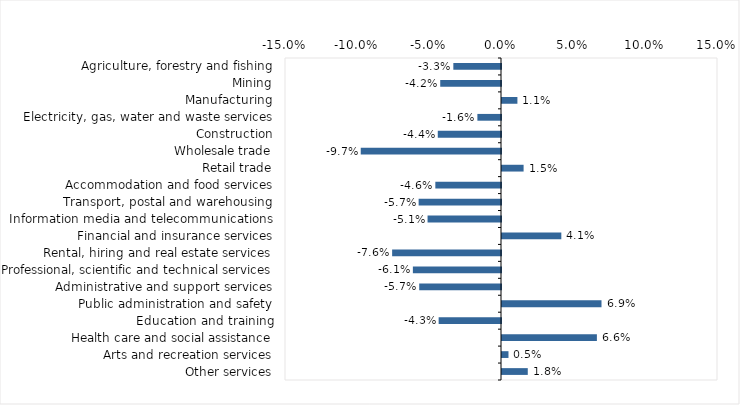
| Category | This week |
|---|---|
| Agriculture, forestry and fishing | -0.033 |
| Mining | -0.042 |
| Manufacturing | 0.011 |
| Electricity, gas, water and waste services | -0.016 |
| Construction | -0.044 |
| Wholesale trade | -0.097 |
| Retail trade | 0.015 |
| Accommodation and food services | -0.046 |
| Transport, postal and warehousing | -0.057 |
| Information media and telecommunications | -0.051 |
| Financial and insurance services | 0.041 |
| Rental, hiring and real estate services | -0.076 |
| Professional, scientific and technical services | -0.061 |
| Administrative and support services | -0.057 |
| Public administration and safety | 0.069 |
| Education and training | -0.043 |
| Health care and social assistance | 0.066 |
| Arts and recreation services | 0.004 |
| Other services | 0.018 |